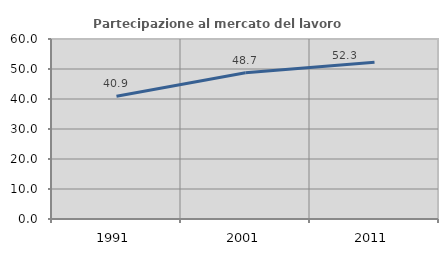
| Category | Partecipazione al mercato del lavoro  femminile |
|---|---|
| 1991.0 | 40.923 |
| 2001.0 | 48.739 |
| 2011.0 | 52.267 |